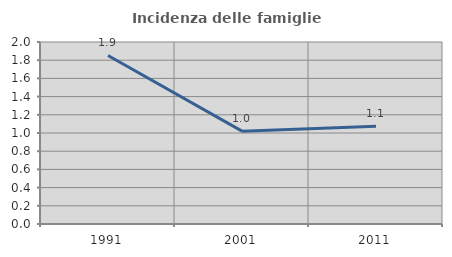
| Category | Incidenza delle famiglie numerose |
|---|---|
| 1991.0 | 1.852 |
| 2001.0 | 1.02 |
| 2011.0 | 1.075 |